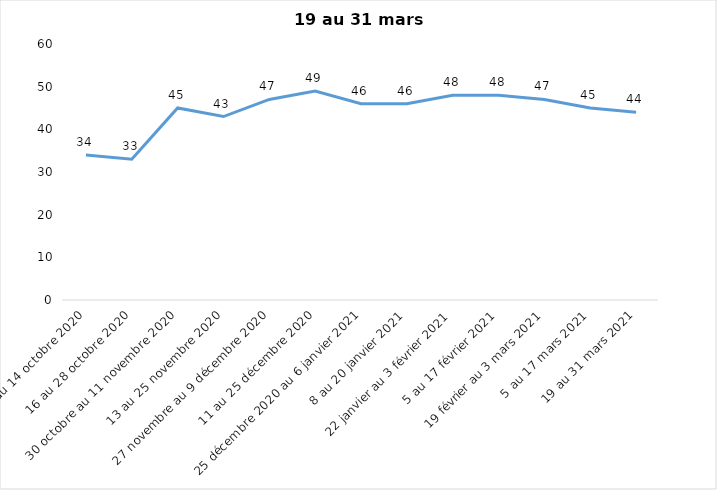
| Category | Toujours aux trois mesures |
|---|---|
| 2 au 14 octobre 2020 | 34 |
| 16 au 28 octobre 2020 | 33 |
| 30 octobre au 11 novembre 2020 | 45 |
| 13 au 25 novembre 2020 | 43 |
| 27 novembre au 9 décembre 2020 | 47 |
| 11 au 25 décembre 2020 | 49 |
| 25 décembre 2020 au 6 janvier 2021 | 46 |
| 8 au 20 janvier 2021 | 46 |
| 22 janvier au 3 février 2021 | 48 |
| 5 au 17 février 2021 | 48 |
| 19 février au 3 mars 2021 | 47 |
| 5 au 17 mars 2021 | 45 |
| 19 au 31 mars 2021 | 44 |